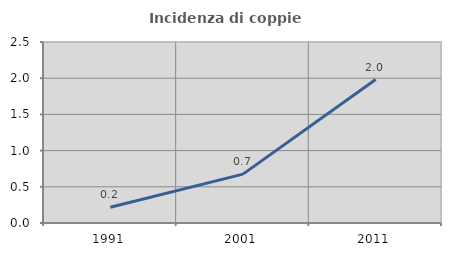
| Category | Incidenza di coppie miste |
|---|---|
| 1991.0 | 0.216 |
| 2001.0 | 0.675 |
| 2011.0 | 1.981 |